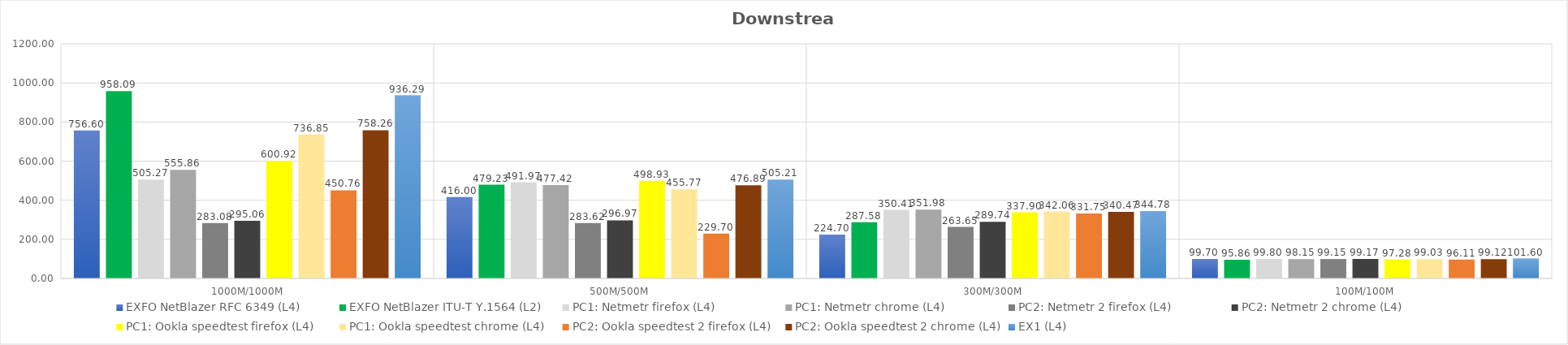
| Category | EXFO NetBlazer RFC 6349 (L4) | EXFO NetBlazer ITU-T Y.1564 (L2) | PC1: Netmetr firefox (L4) | PC1: Netmetr chrome (L4) | PC2: Netmetr 2 firefox (L4) | PC2: Netmetr 2 chrome (L4) | PC1: Ookla speedtest firefox (L4) | PC1: Ookla speedtest chrome (L4) | PC2: Ookla speedtest 2 firefox (L4) | PC2: Ookla speedtest 2 chrome (L4) | EX1 (L4) | Series 6 |
|---|---|---|---|---|---|---|---|---|---|---|---|---|
| 1000M/1000M | 756.6 | 958.088 | 505.265 | 555.862 | 283.084 | 295.058 | 600.92 | 736.85 | 450.76 | 758.26 | 936.29 |  |
| 500M/500M | 416 | 479.23 | 491.968 | 477.419 | 283.618 | 296.973 | 498.93 | 455.77 | 229.7 | 476.89 | 505.21 |  |
| 300M/300M | 224.7 | 287.576 | 350.406 | 351.979 | 263.653 | 289.741 | 337.9 | 342.06 | 331.75 | 340.47 | 344.78 |  |
| 100M/100M | 99.7 | 95.859 | 99.803 | 98.146 | 99.153 | 99.166 | 97.28 | 99.03 | 96.11 | 99.12 | 101.6 |  |